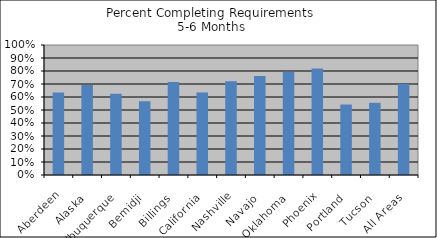
| Category | % Comp. Req. |
|---|---|
| Aberdeen | 0.635 |
| Alaska | 0.692 |
| Albuquerque | 0.625 |
| Bemidji | 0.567 |
| Billings | 0.715 |
| California | 0.635 |
| Nashville | 0.722 |
| Navajo | 0.762 |
| Oklahoma | 0.794 |
| Phoenix | 0.82 |
| Portland | 0.542 |
| Tucson | 0.556 |
| All Areas | 0.7 |